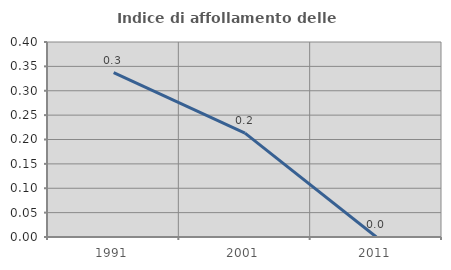
| Category | Indice di affollamento delle abitazioni  |
|---|---|
| 1991.0 | 0.337 |
| 2001.0 | 0.213 |
| 2011.0 | 0 |